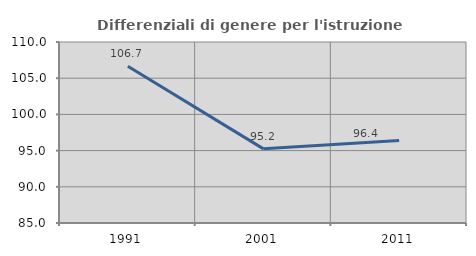
| Category | Differenziali di genere per l'istruzione superiore |
|---|---|
| 1991.0 | 106.66 |
| 2001.0 | 95.24 |
| 2011.0 | 96.395 |